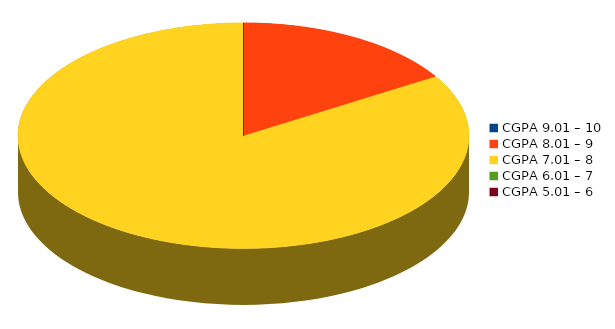
| Category | Number of students |
|---|---|
| CGPA 9.01 – 10 | 0 |
| CGPA 8.01 – 9 | 6 |
| CGPA 7.01 – 8 | 31 |
| CGPA 6.01 – 7 | 0 |
| CGPA 5.01 – 6 | 0 |